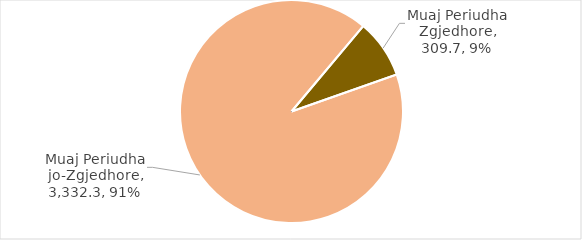
| Category | Total Grante |
|---|---|
| Muaj Periudha Zgjedhore | 309.685 |
| Muaj Periudha jo-Zgjedhore | 3332.322 |